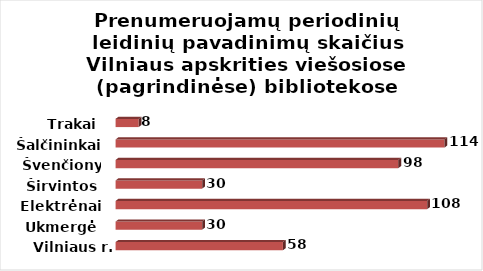
| Category | Series 0 |
|---|---|
| Vilniaus r. | 58 |
| Ukmergė | 30 |
| Elektrėnai | 108 |
| Širvintos | 30 |
| Švenčionys | 98 |
| Šalčininkai | 114 |
| Trakai | 8 |